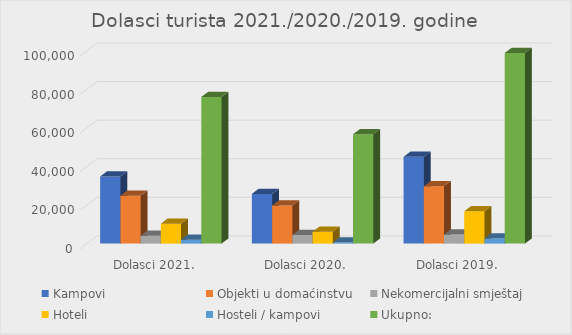
| Category | Kampovi | Objekti u domaćinstvu | Nekomercijalni smještaj | Hoteli | Hosteli / kampovi | Ukupno: |
|---|---|---|---|---|---|---|
| Dolasci 2021. | 34808 | 24828 | 4022 | 10336 | 2047 | 76041 |
| Dolasci 2020. | 25770 | 19745 | 4458 | 6156 | 553 | 56682 |
| Dolasci 2019. | 44991 | 29714 | 4691 | 16789 | 2620 | 98805 |